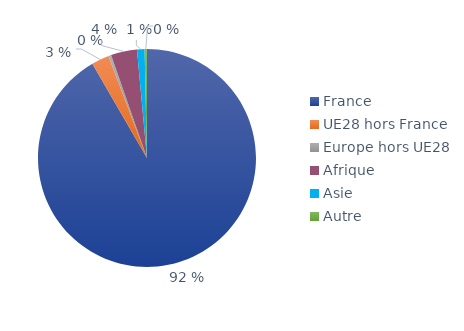
| Category | Series 0 |
|---|---|
| France | 0.917 |
| UE28 hors France | 0.026 |
| Europe hors UE28 | 0.004 |
| Afrique | 0.039 |
| Asie | 0.011 |
| Autre | 0.003 |